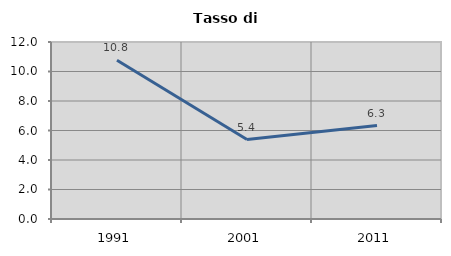
| Category | Tasso di disoccupazione   |
|---|---|
| 1991.0 | 10.759 |
| 2001.0 | 5.386 |
| 2011.0 | 6.338 |